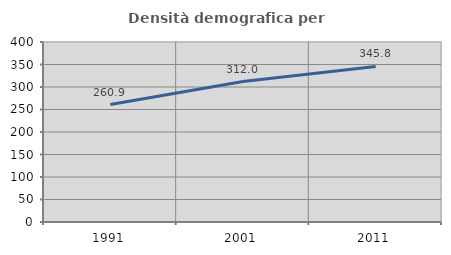
| Category | Densità demografica |
|---|---|
| 1991.0 | 260.943 |
| 2001.0 | 312.04 |
| 2011.0 | 345.802 |